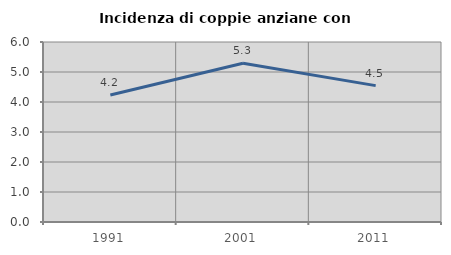
| Category | Incidenza di coppie anziane con figli |
|---|---|
| 1991.0 | 4.233 |
| 2001.0 | 5.291 |
| 2011.0 | 4.545 |